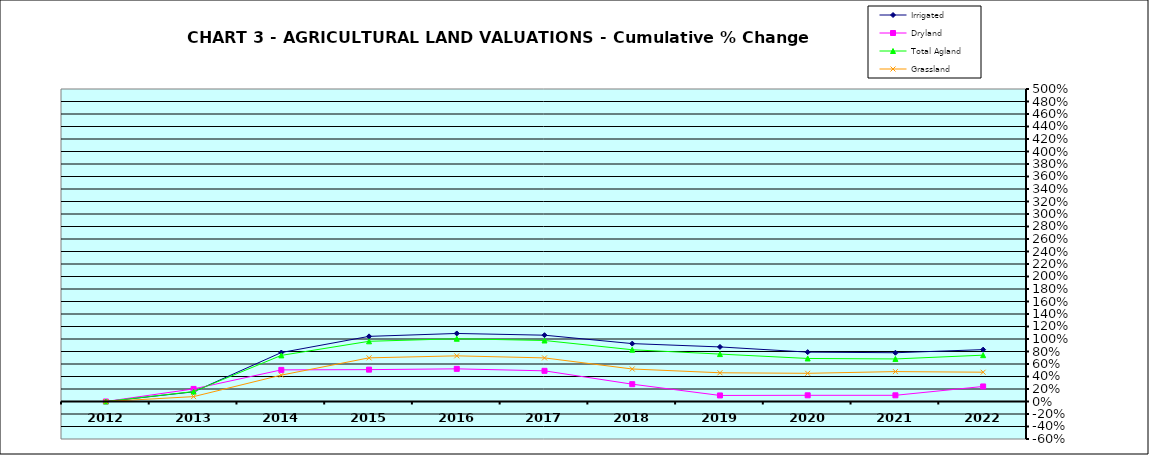
| Category | Irrigated | Dryland | Total Agland | Grassland |
|---|---|---|---|---|
| 2012.0 | 0 | 0 | 0 | 0 |
| 2013.0 | 0.155 | 0.201 | 0.159 | 0.078 |
| 2014.0 | 0.784 | 0.506 | 0.738 | 0.422 |
| 2015.0 | 1.042 | 0.51 | 0.963 | 0.698 |
| 2016.0 | 1.089 | 0.522 | 1.004 | 0.73 |
| 2017.0 | 1.061 | 0.491 | 0.976 | 0.698 |
| 2018.0 | 0.926 | 0.277 | 0.828 | 0.52 |
| 2019.0 | 0.873 | 0.097 | 0.759 | 0.46 |
| 2020.0 | 0.79 | 0.099 | 0.689 | 0.451 |
| 2021.0 | 0.78 | 0.099 | 0.681 | 0.479 |
| 2022.0 | 0.83 | 0.241 | 0.741 | 0.469 |